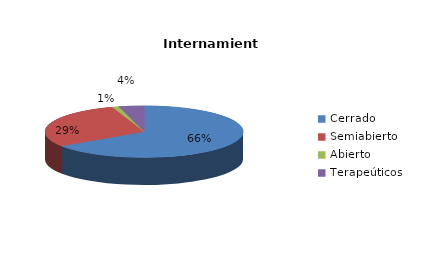
| Category | Series 0 |
|---|---|
| Cerrado | 304 |
| Semiabierto | 136 |
| Abierto | 5 |
| Terapeúticos | 19 |